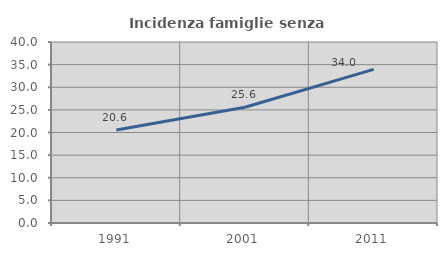
| Category | Incidenza famiglie senza nuclei |
|---|---|
| 1991.0 | 20.551 |
| 2001.0 | 25.571 |
| 2011.0 | 33.953 |